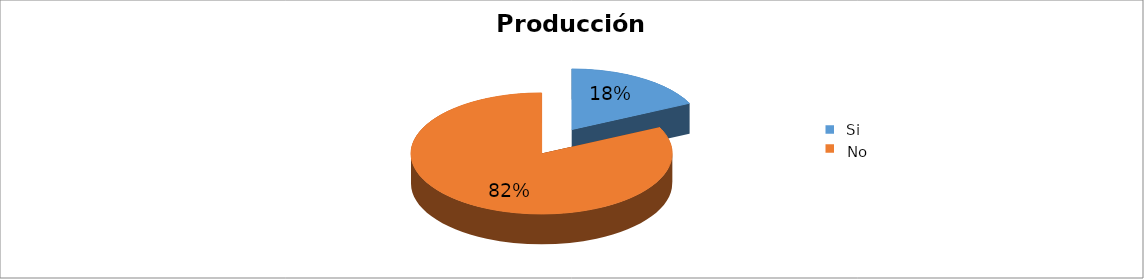
| Category | Series 0 |
|---|---|
| 0 | 0.179 |
| 1 | 0.821 |